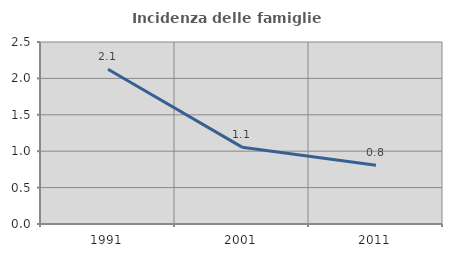
| Category | Incidenza delle famiglie numerose |
|---|---|
| 1991.0 | 2.125 |
| 2001.0 | 1.055 |
| 2011.0 | 0.807 |